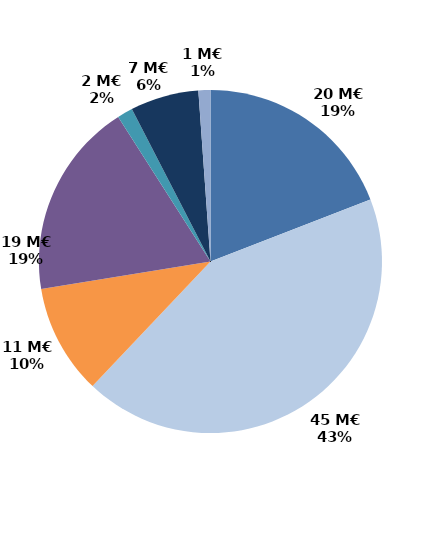
| Category | Series 0 |
|---|---|
| Accueil et information (CEP 1) | 20.003 |
| Accompagnement renforcé (CEP 2 et 3) | 44.935 |
| Suivi | 10.856 |
| Missions locales | 19.363 |
| CSP | 1.531 |
| Aide à la création d'entreprise | 6.749 |
| Aide à l'insertion | 1.183 |